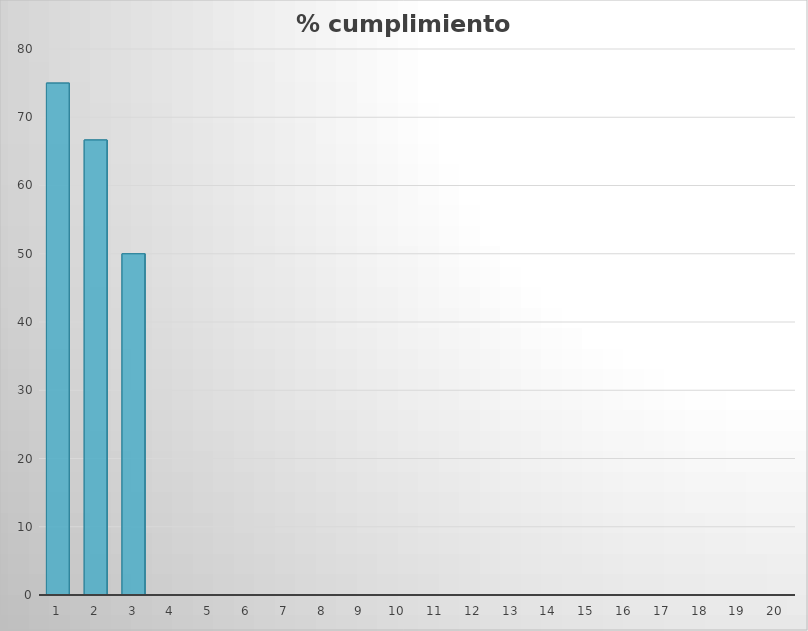
| Category | % cumplimiento indicadores |
|---|---|
| 0 | 75 |
| 1 | 66.667 |
| 2 | 50 |
| 3 | 0 |
| 4 | 0 |
| 5 | 0 |
| 6 | 0 |
| 7 | 0 |
| 8 | 0 |
| 9 | 0 |
| 10 | 0 |
| 11 | 0 |
| 12 | 0 |
| 13 | 0 |
| 14 | 0 |
| 15 | 0 |
| 16 | 0 |
| 17 | 0 |
| 18 | 0 |
| 19 | 0 |